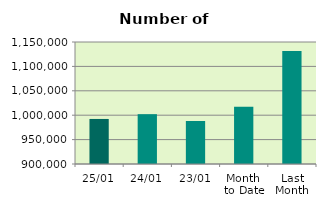
| Category | Series 0 |
|---|---|
| 25/01 | 992298 |
| 24/01 | 1002106 |
| 23/01 | 987980 |
| Month 
to Date | 1017101.556 |
| Last
Month | 1131500.526 |